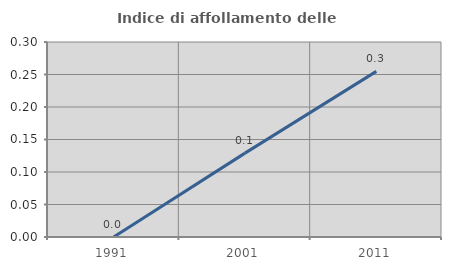
| Category | Indice di affollamento delle abitazioni  |
|---|---|
| 1991.0 | 0 |
| 2001.0 | 0.129 |
| 2011.0 | 0.255 |